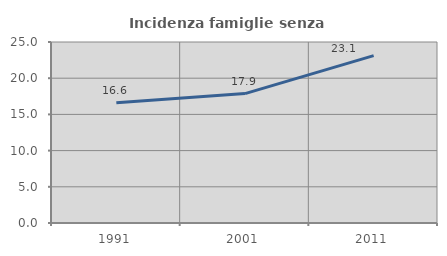
| Category | Incidenza famiglie senza nuclei |
|---|---|
| 1991.0 | 16.616 |
| 2001.0 | 17.873 |
| 2011.0 | 23.118 |